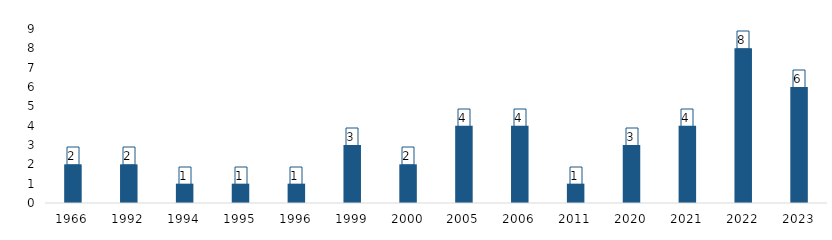
| Category | 2 |
|---|---|
| 1966.0 | 2 |
| 1992.0 | 2 |
| 1994.0 | 1 |
| 1995.0 | 1 |
| 1996.0 | 1 |
| 1999.0 | 3 |
| 2000.0 | 2 |
| 2005.0 | 4 |
| 2006.0 | 4 |
| 2011.0 | 1 |
| 2020.0 | 3 |
| 2021.0 | 4 |
| 2022.0 | 8 |
| 2023.0 | 6 |